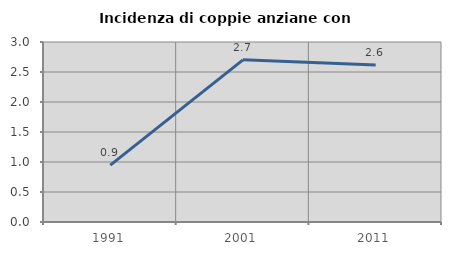
| Category | Incidenza di coppie anziane con figli |
|---|---|
| 1991.0 | 0.949 |
| 2001.0 | 2.703 |
| 2011.0 | 2.616 |